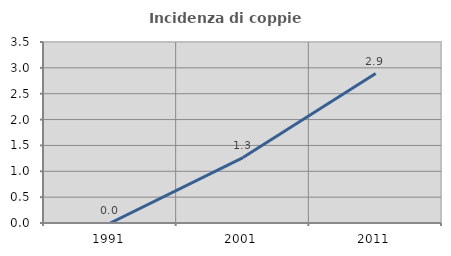
| Category | Incidenza di coppie miste |
|---|---|
| 1991.0 | 0 |
| 2001.0 | 1.266 |
| 2011.0 | 2.89 |